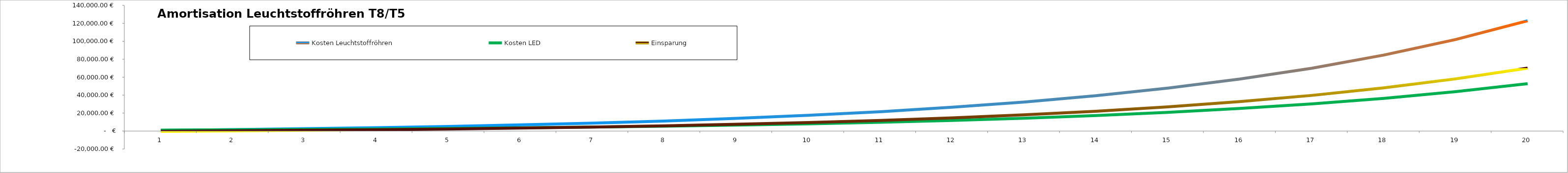
| Category | Kosten Leuchtstoffröhren | Kosten LED | Einsparung |
|---|---|---|---|
| 0 | 786.517 | 1076.541 | -290.024 |
| 1 | 1570.338 | 1410.391 | 159.947 |
| 2 | 2644.256 | 1811.01 | 833.246 |
| 3 | 3772.958 | 2291.754 | 1481.205 |
| 4 | 5127.401 | 2868.646 | 2258.755 |
| 5 | 6886.065 | 3560.917 | 3325.148 |
| 6 | 8836.462 | 4391.641 | 4444.821 |
| 7 | 11176.938 | 5388.511 | 5788.427 |
| 8 | 14118.843 | 6584.754 | 7534.089 |
| 9 | 17489.129 | 8020.246 | 9468.883 |
| 10 | 21533.472 | 9742.837 | 11790.635 |
| 11 | 26520.017 | 11809.946 | 14710.072 |
| 12 | 32343.872 | 14290.476 | 18053.395 |
| 13 | 39332.497 | 17267.113 | 22065.384 |
| 14 | 47852.18 | 20839.077 | 27013.103 |
| 15 | 57915.8 | 25125.433 | 32790.367 |
| 16 | 69992.144 | 30269.061 | 39723.083 |
| 17 | 84617.09 | 36441.415 | 48175.675 |
| 18 | 102007.025 | 43848.239 | 58158.786 |
| 19 | 122874.948 | 52736.428 | 70138.519 |